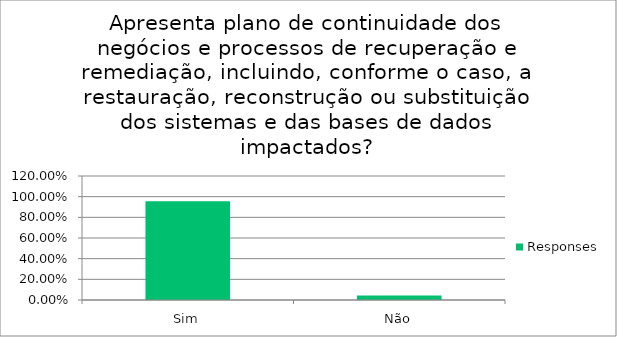
| Category | Responses |
|---|---|
| Sim | 0.956 |
| Não | 0.044 |